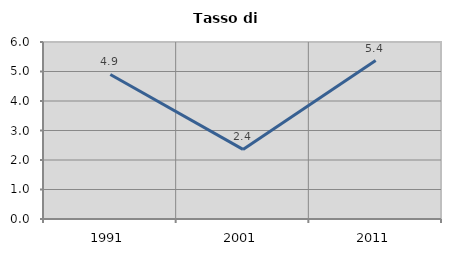
| Category | Tasso di disoccupazione   |
|---|---|
| 1991.0 | 4.899 |
| 2001.0 | 2.359 |
| 2011.0 | 5.37 |